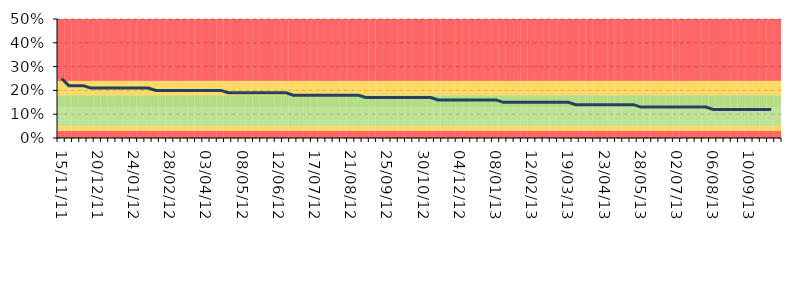
| Category | Series 1 | Series 2 | Series 3 | Series 4 | Series 5 | Series 6 |
|---|---|---|---|---|---|---|
| 15/11/11 | 0.03 | 0.02 | 0.08 | 0.05 | 0.06 | 0.26 |
| 22/11/11 | 0.03 | 0.02 | 0.08 | 0.05 | 0.06 | 0.26 |
| 29/11/11 | 0.03 | 0.02 | 0.08 | 0.05 | 0.06 | 0.26 |
| 06/12/11 | 0.03 | 0.02 | 0.08 | 0.05 | 0.06 | 0.26 |
| 13/12/11 | 0.03 | 0.02 | 0.08 | 0.05 | 0.06 | 0.26 |
| 20/12/11 | 0.03 | 0.02 | 0.08 | 0.05 | 0.06 | 0.26 |
| 27/12/11 | 0.03 | 0.02 | 0.08 | 0.05 | 0.06 | 0.26 |
| 03/01/12 | 0.03 | 0.02 | 0.08 | 0.05 | 0.06 | 0.26 |
| 10/01/12 | 0.03 | 0.02 | 0.08 | 0.05 | 0.06 | 0.26 |
| 17/01/12 | 0.03 | 0.02 | 0.08 | 0.05 | 0.06 | 0.26 |
| 24/01/12 | 0.03 | 0.02 | 0.08 | 0.05 | 0.06 | 0.26 |
| 31/01/12 | 0.03 | 0.02 | 0.08 | 0.05 | 0.06 | 0.26 |
| 07/02/12 | 0.03 | 0.02 | 0.08 | 0.05 | 0.06 | 0.26 |
| 14/02/12 | 0.03 | 0.02 | 0.08 | 0.05 | 0.06 | 0.26 |
| 21/02/12 | 0.03 | 0.02 | 0.08 | 0.05 | 0.06 | 0.26 |
| 28/02/12 | 0.03 | 0.02 | 0.08 | 0.05 | 0.06 | 0.26 |
| 06/03/12 | 0.03 | 0.02 | 0.08 | 0.05 | 0.06 | 0.26 |
| 13/03/12 | 0.03 | 0.02 | 0.08 | 0.05 | 0.06 | 0.26 |
| 20/03/12 | 0.03 | 0.02 | 0.08 | 0.05 | 0.06 | 0.26 |
| 27/03/12 | 0.03 | 0.02 | 0.08 | 0.05 | 0.06 | 0.26 |
| 03/04/12 | 0.03 | 0.02 | 0.08 | 0.05 | 0.06 | 0.26 |
| 10/04/12 | 0.03 | 0.02 | 0.08 | 0.05 | 0.06 | 0.26 |
| 17/04/12 | 0.03 | 0.02 | 0.08 | 0.05 | 0.06 | 0.26 |
| 24/04/12 | 0.03 | 0.02 | 0.08 | 0.05 | 0.06 | 0.26 |
| 01/05/12 | 0.03 | 0.02 | 0.08 | 0.05 | 0.06 | 0.26 |
| 08/05/12 | 0.03 | 0.02 | 0.08 | 0.05 | 0.06 | 0.26 |
| 15/05/12 | 0.03 | 0.02 | 0.08 | 0.05 | 0.06 | 0.26 |
| 22/05/12 | 0.03 | 0.02 | 0.08 | 0.05 | 0.06 | 0.26 |
| 29/05/12 | 0.03 | 0.02 | 0.08 | 0.05 | 0.06 | 0.26 |
| 05/06/12 | 0.03 | 0.02 | 0.08 | 0.05 | 0.06 | 0.26 |
| 12/06/12 | 0.03 | 0.02 | 0.08 | 0.05 | 0.06 | 0.26 |
| 19/06/12 | 0.03 | 0.02 | 0.08 | 0.05 | 0.06 | 0.26 |
| 26/06/12 | 0.03 | 0.02 | 0.08 | 0.05 | 0.06 | 0.26 |
| 03/07/12 | 0.03 | 0.02 | 0.08 | 0.05 | 0.06 | 0.26 |
| 10/07/12 | 0.03 | 0.02 | 0.08 | 0.05 | 0.06 | 0.26 |
| 17/07/12 | 0.03 | 0.02 | 0.08 | 0.05 | 0.06 | 0.26 |
| 24/07/12 | 0.03 | 0.02 | 0.08 | 0.05 | 0.06 | 0.26 |
| 31/07/12 | 0.03 | 0.02 | 0.08 | 0.05 | 0.06 | 0.26 |
| 07/08/12 | 0.03 | 0.02 | 0.08 | 0.05 | 0.06 | 0.26 |
| 14/08/12 | 0.03 | 0.02 | 0.08 | 0.05 | 0.06 | 0.26 |
| 21/08/12 | 0.03 | 0.02 | 0.08 | 0.05 | 0.06 | 0.26 |
| 28/08/12 | 0.03 | 0.02 | 0.08 | 0.05 | 0.06 | 0.26 |
| 04/09/12 | 0.03 | 0.02 | 0.08 | 0.05 | 0.06 | 0.26 |
| 11/09/12 | 0.03 | 0.02 | 0.08 | 0.05 | 0.06 | 0.26 |
| 18/09/12 | 0.03 | 0.02 | 0.08 | 0.05 | 0.06 | 0.26 |
| 25/09/12 | 0.03 | 0.02 | 0.08 | 0.05 | 0.06 | 0.26 |
| 02/10/12 | 0.03 | 0.02 | 0.08 | 0.05 | 0.06 | 0.26 |
| 09/10/12 | 0.03 | 0.02 | 0.08 | 0.05 | 0.06 | 0.26 |
| 16/10/12 | 0.03 | 0.02 | 0.08 | 0.05 | 0.06 | 0.26 |
| 23/10/12 | 0.03 | 0.02 | 0.08 | 0.05 | 0.06 | 0.26 |
| 30/10/12 | 0.03 | 0.02 | 0.08 | 0.05 | 0.06 | 0.26 |
| 06/11/12 | 0.03 | 0.02 | 0.08 | 0.05 | 0.06 | 0.26 |
| 13/11/12 | 0.03 | 0.02 | 0.08 | 0.05 | 0.06 | 0.26 |
| 20/11/12 | 0.03 | 0.02 | 0.08 | 0.05 | 0.06 | 0.26 |
| 27/11/12 | 0.03 | 0.02 | 0.08 | 0.05 | 0.06 | 0.26 |
| 04/12/12 | 0.03 | 0.02 | 0.08 | 0.05 | 0.06 | 0.26 |
| 11/12/12 | 0.03 | 0.02 | 0.08 | 0.05 | 0.06 | 0.26 |
| 18/12/12 | 0.03 | 0.02 | 0.08 | 0.05 | 0.06 | 0.26 |
| 25/12/12 | 0.03 | 0.02 | 0.08 | 0.05 | 0.06 | 0.26 |
| 01/01/13 | 0.03 | 0.02 | 0.08 | 0.05 | 0.06 | 0.26 |
| 08/01/13 | 0.03 | 0.02 | 0.08 | 0.05 | 0.06 | 0.26 |
| 15/01/13 | 0.03 | 0.02 | 0.08 | 0.05 | 0.06 | 0.26 |
| 22/01/13 | 0.03 | 0.02 | 0.08 | 0.05 | 0.06 | 0.26 |
| 29/01/13 | 0.03 | 0.02 | 0.08 | 0.05 | 0.06 | 0.26 |
| 05/02/13 | 0.03 | 0.02 | 0.08 | 0.05 | 0.06 | 0.26 |
| 12/02/13 | 0.03 | 0.02 | 0.08 | 0.05 | 0.06 | 0.26 |
| 19/02/13 | 0.03 | 0.02 | 0.08 | 0.05 | 0.06 | 0.26 |
| 26/02/13 | 0.03 | 0.02 | 0.08 | 0.05 | 0.06 | 0.26 |
| 05/03/13 | 0.03 | 0.02 | 0.08 | 0.05 | 0.06 | 0.26 |
| 12/03/13 | 0.03 | 0.02 | 0.08 | 0.05 | 0.06 | 0.26 |
| 19/03/13 | 0.03 | 0.02 | 0.08 | 0.05 | 0.06 | 0.26 |
| 26/03/13 | 0.03 | 0.02 | 0.08 | 0.05 | 0.06 | 0.26 |
| 02/04/13 | 0.03 | 0.02 | 0.08 | 0.05 | 0.06 | 0.26 |
| 09/04/13 | 0.03 | 0.02 | 0.08 | 0.05 | 0.06 | 0.26 |
| 16/04/13 | 0.03 | 0.02 | 0.08 | 0.05 | 0.06 | 0.26 |
| 23/04/13 | 0.03 | 0.02 | 0.08 | 0.05 | 0.06 | 0.26 |
| 30/04/13 | 0.03 | 0.02 | 0.08 | 0.05 | 0.06 | 0.26 |
| 07/05/13 | 0.03 | 0.02 | 0.08 | 0.05 | 0.06 | 0.26 |
| 14/05/13 | 0.03 | 0.02 | 0.08 | 0.05 | 0.06 | 0.26 |
| 21/05/13 | 0.03 | 0.02 | 0.08 | 0.05 | 0.06 | 0.26 |
| 28/05/13 | 0.03 | 0.02 | 0.08 | 0.05 | 0.06 | 0.26 |
| 04/06/13 | 0.03 | 0.02 | 0.08 | 0.05 | 0.06 | 0.26 |
| 11/06/13 | 0.03 | 0.02 | 0.08 | 0.05 | 0.06 | 0.26 |
| 18/06/13 | 0.03 | 0.02 | 0.08 | 0.05 | 0.06 | 0.26 |
| 25/06/13 | 0.03 | 0.02 | 0.08 | 0.05 | 0.06 | 0.26 |
| 02/07/13 | 0.03 | 0.02 | 0.08 | 0.05 | 0.06 | 0.26 |
| 09/07/13 | 0.03 | 0.02 | 0.08 | 0.05 | 0.06 | 0.26 |
| 16/07/13 | 0.03 | 0.02 | 0.08 | 0.05 | 0.06 | 0.26 |
| 23/07/13 | 0.03 | 0.02 | 0.08 | 0.05 | 0.06 | 0.26 |
| 30/07/13 | 0.03 | 0.02 | 0.08 | 0.05 | 0.06 | 0.26 |
| 06/08/13 | 0.03 | 0.02 | 0.08 | 0.05 | 0.06 | 0.26 |
| 13/08/13 | 0.03 | 0.02 | 0.08 | 0.05 | 0.06 | 0.26 |
| 20/08/13 | 0.03 | 0.02 | 0.08 | 0.05 | 0.06 | 0.26 |
| 27/08/13 | 0.03 | 0.02 | 0.08 | 0.05 | 0.06 | 0.26 |
| 03/09/13 | 0.03 | 0.02 | 0.08 | 0.05 | 0.06 | 0.26 |
| 10/09/13 | 0.03 | 0.02 | 0.08 | 0.05 | 0.06 | 0.26 |
| 17/09/13 | 0.03 | 0.02 | 0.08 | 0.05 | 0.06 | 0.26 |
| 24/09/13 | 0.03 | 0.02 | 0.08 | 0.05 | 0.06 | 0.26 |
| 01/10/13 | 0.03 | 0.02 | 0.08 | 0.05 | 0.06 | 0.26 |